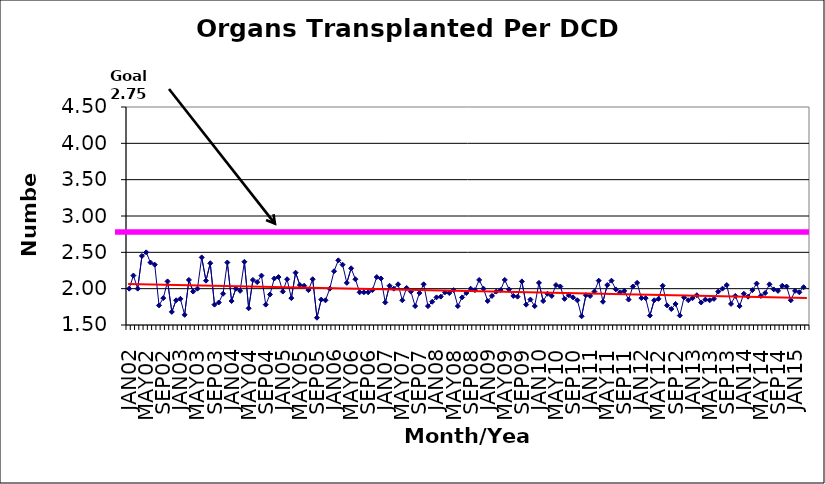
| Category | Series 0 |
|---|---|
| JAN02 | 2 |
| FEB02 | 2.18 |
| MAR02 | 2 |
| APR02 | 2.45 |
| MAY02 | 2.5 |
| JUN02 | 2.36 |
| JUL02 | 2.33 |
| AUG02 | 1.77 |
| SEP02 | 1.87 |
| OCT02 | 2.1 |
| NOV02 | 1.68 |
| DEC02 | 1.84 |
| JAN03 | 1.86 |
| FEB03 | 1.64 |
| MAR03 | 2.12 |
| APR03 | 1.96 |
| MAY03 | 2 |
| JUN03 | 2.43 |
| JUL03 | 2.11 |
| AUG03 | 2.35 |
| SEP03 | 1.78 |
| OCT03 | 1.81 |
| NOV03 | 1.93 |
| DEC03 | 2.36 |
| JAN04 | 1.83 |
| FEB04 | 2 |
| MAR04 | 1.97 |
| APR04 | 2.37 |
| MAY04 | 1.73 |
| JUN04 | 2.12 |
| JUL04 | 2.09 |
| AUG04 | 2.18 |
| SEP04 | 1.78 |
| OCT04 | 1.92 |
| NOV04 | 2.14 |
| DEC04 | 2.16 |
| JAN05 | 1.96 |
| FEB05 | 2.13 |
| MAR05 | 1.87 |
| APR05 | 2.22 |
| MAY05 | 2.05 |
| JUN05 | 2.04 |
| JUL05 | 1.98 |
| AUG05 | 2.13 |
| SEP05 | 1.6 |
| OCT05 | 1.85 |
| NOV05 | 1.84 |
| DEC05 | 2 |
| JAN06 | 2.24 |
| FEB06 | 2.39 |
| MAR06 | 2.33 |
| APR06 | 2.08 |
| MAY06 | 2.28 |
| JUN06 | 2.13 |
| JUL06 | 1.95 |
| AUG06 | 1.95 |
| SEP06 | 1.95 |
| OCT06 | 1.98 |
| NOV06 | 2.16 |
| DEC06 | 2.14 |
| JAN07 | 1.81 |
| FEB07 | 2.04 |
| MAR07 | 2 |
| APR07 | 2.06 |
| MAY07 | 1.84 |
| JUN07 | 2.01 |
| JUL07 | 1.96 |
| AUG07 | 1.76 |
| SEP07 | 1.94 |
| OCT07 | 2.06 |
| NOV07 | 1.76 |
| DEC07 | 1.82 |
| JAN08 | 1.88 |
| FEB08 | 1.89 |
| MAR08 | 1.95 |
| APR08 | 1.94 |
| MAY08 | 1.98 |
| JUN08 | 1.76 |
| JUL08 | 1.88 |
| AUG08 | 1.94 |
| SEP08 | 2 |
| OCT08 | 1.98 |
| NOV08 | 2.12 |
| DEC08 | 2 |
| JAN09 | 1.83 |
| FEB09 | 1.9 |
| MAR09 | 1.96 |
| APR09 | 1.98 |
| MAY09 | 2.12 |
| JUN09 | 1.99 |
| JUL09 | 1.9 |
| AUG09 | 1.89 |
| SEP09 | 2.1 |
| OCT09 | 1.78 |
| NOV09 | 1.85 |
| DEC09 | 1.76 |
| JAN10 | 2.08 |
| FEB10 | 1.83 |
| MAR10 | 1.93 |
| APR10 | 1.9 |
| MAY10 | 2.05 |
| JUN10 | 2.03 |
| JUL10 | 1.86 |
| AUG10 | 1.91 |
| SEP10 | 1.88 |
| OCT10 | 1.84 |
| NOV10 | 1.62 |
| DEC10 | 1.91 |
| JAN11 | 1.9 |
| FEB11 | 1.96 |
| MAR11 | 2.11 |
| APR11 | 1.82 |
| MAY11 | 2.05 |
| JUN11 | 2.11 |
| JUL11 | 1.99 |
| AUG11 | 1.95 |
| SEP11 | 1.97 |
| OCT11 | 1.85 |
| NOV11 | 2.03 |
| DEC11 | 2.08 |
| JAN12 | 1.87 |
| FEB12 | 1.87 |
| MAR12 | 1.63 |
| APR12 | 1.84 |
| MAY12 | 1.86 |
| JUN12 | 2.04 |
| JUL12 | 1.77 |
| AUG12 | 1.72 |
| SEP12 | 1.79 |
| OCT12 | 1.63 |
| NOV12 | 1.88 |
| DEC12 | 1.84 |
| JAN13 | 1.87 |
| FEB13 | 1.91 |
| MAR13 | 1.81 |
| APR13 | 1.85 |
| MAY13 | 1.84 |
| JUN13 | 1.86 |
| JUL13 | 1.96 |
| AUG13 | 2 |
| SEP13 | 2.05 |
| OCT13 | 1.79 |
| NOV13 | 1.9 |
| DEC13 | 1.76 |
| JAN14 | 1.93 |
| FEB14 | 1.89 |
| MAR14 | 1.98 |
| APR14 | 2.07 |
| MAY14 | 1.9 |
| JUN14 | 1.94 |
| JUL14 | 2.06 |
| AUG14 | 1.99 |
| SEP14 | 1.97 |
| OCT14 | 2.04 |
| NOV14 | 2.03 |
| DEC14 | 1.84 |
| JAN15 | 1.97 |
| FEB15 | 1.95 |
| MAR15 | 2.02 |